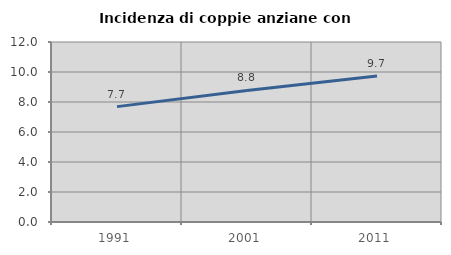
| Category | Incidenza di coppie anziane con figli |
|---|---|
| 1991.0 | 7.692 |
| 2001.0 | 8.772 |
| 2011.0 | 9.735 |